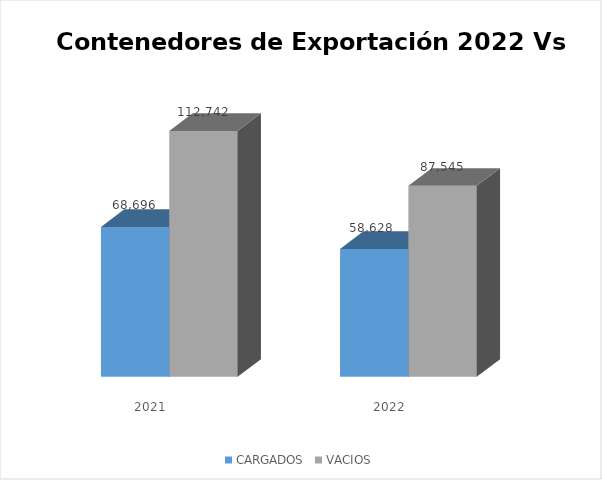
| Category | CARGADOS | VACIOS |
|---|---|---|
| 2021.0 | 68696 | 112742 |
| 2022.0 | 58628 | 87545 |